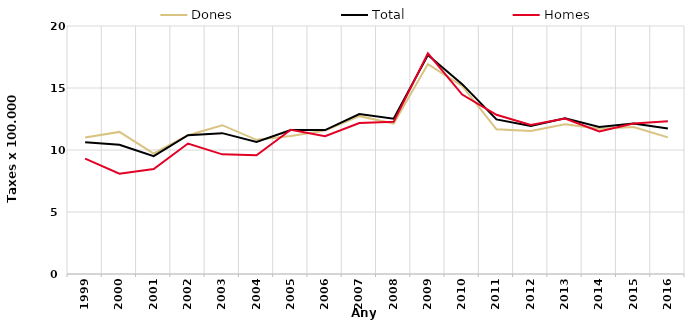
| Category | Dones | Total | Homes |
|---|---|---|---|
| 1999.0 | 11 | 10.63 | 9.31 |
| 2000.0 | 11.46 | 10.42 | 8.09 |
| 2001.0 | 9.72 | 9.5 | 8.46 |
| 2002.0 | 11.19 | 11.19 | 10.52 |
| 2003.0 | 12 | 11.36 | 9.65 |
| 2004.0 | 10.82 | 10.65 | 9.57 |
| 2005.0 | 11.12 | 11.61 | 11.63 |
| 2006.0 | 11.56 | 11.61 | 11.12 |
| 2007.0 | 12.73 | 12.9 | 12.18 |
| 2008.0 | 12.13 | 12.52 | 12.27 |
| 2009.0 | 16.93 | 17.66 | 17.79 |
| 2010.0 | 15.17 | 15.31 | 14.47 |
| 2011.0 | 11.67 | 12.47 | 12.84 |
| 2012.0 | 11.53 | 11.93 | 12.02 |
| 2013.0 | 12.07 | 12.56 | 12.53 |
| 2014.0 | 11.71 | 11.85 | 11.49 |
| 2015.0 | 11.86 | 12.13 | 12.13 |
| 2016.0 | 11.02 | 11.74 | 12.31 |